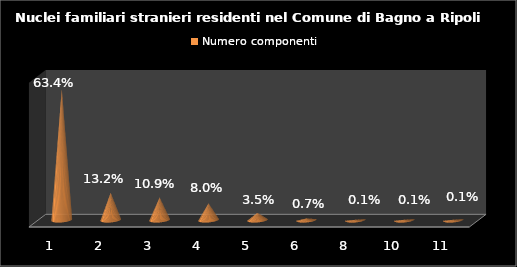
| Category | Numero componenti |
|---|---|
| 1.0 | 0.634 |
| 2.0 | 0.132 |
| 3.0 | 0.109 |
| 4.0 | 0.08 |
| 5.0 | 0.035 |
| 6.0 | 0.007 |
| 8.0 | 0.001 |
| 10.0 | 0.001 |
| 11.0 | 0.001 |